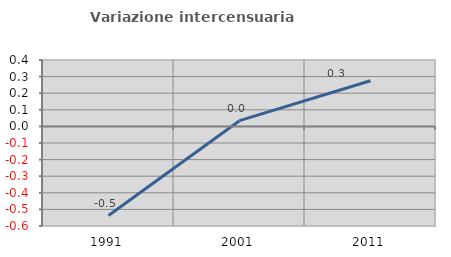
| Category | Variazione intercensuaria annua |
|---|---|
| 1991.0 | -0.537 |
| 2001.0 | 0.034 |
| 2011.0 | 0.275 |